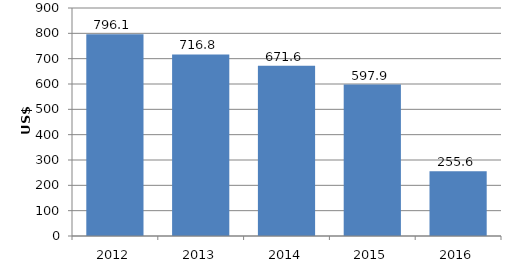
| Category | Series 0 |
|---|---|
| 2012.0 | 796.064 |
| 2013.0 | 716.796 |
| 2014.0 | 671.642 |
| 2015.0 | 597.86 |
| 2016.0 | 255.609 |